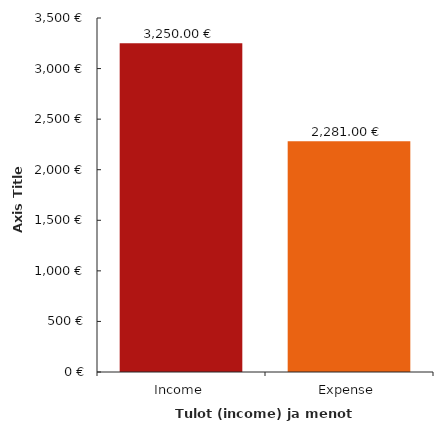
| Category | Data_grafu |
|---|---|
| 0 | 3250 |
| 1 | 2281 |